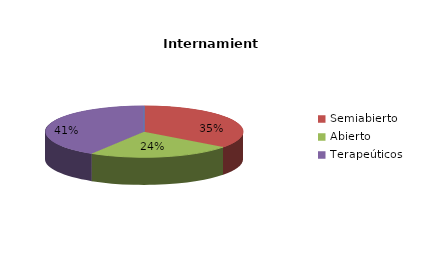
| Category | Series 0 |
|---|---|
| Cerrado | 0 |
| Semiabierto | 6 |
| Abierto | 4 |
| Terapeúticos | 7 |